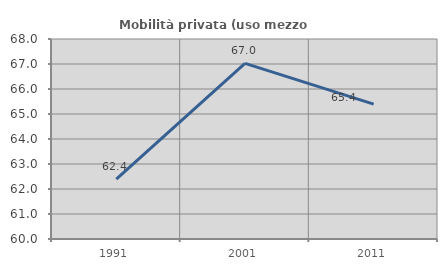
| Category | Mobilità privata (uso mezzo privato) |
|---|---|
| 1991.0 | 62.393 |
| 2001.0 | 67.027 |
| 2011.0 | 65.392 |